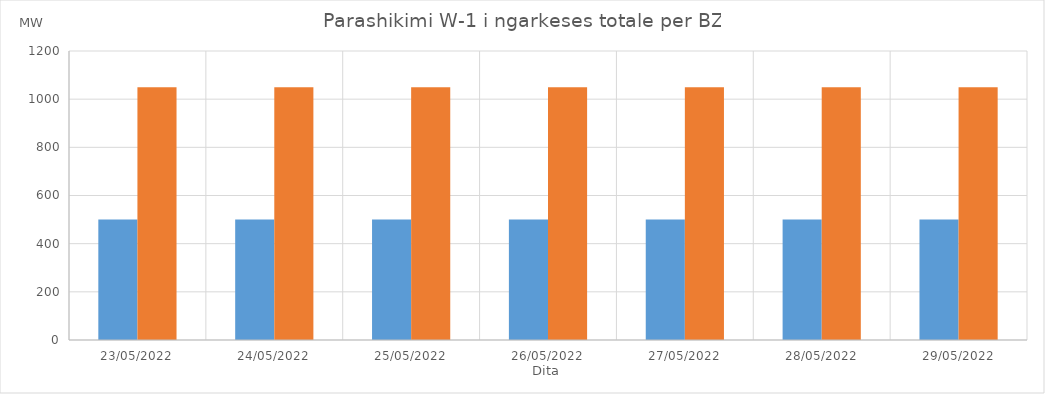
| Category | Min (MW) | Max (MW) |
|---|---|---|
| 23/05/2022 | 500 | 1050 |
| 24/05/2022 | 500 | 1050 |
| 25/05/2022 | 500 | 1050 |
| 26/05/2022 | 500 | 1050 |
| 27/05/2022 | 500 | 1050 |
| 28/05/2022 | 500 | 1050 |
| 29/05/2022 | 500 | 1050 |